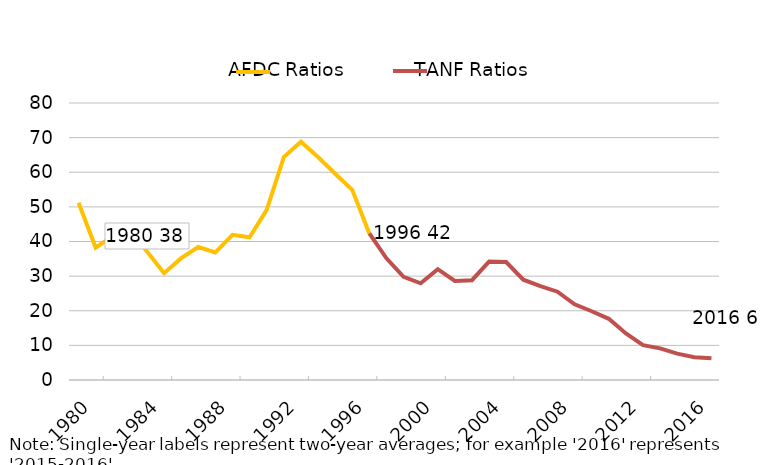
| Category | Arizona |
|---|---|
| nan | 51.211 |
| 1980.0 | 38.248 |
| nan | 41.587 |
| nan | 43.655 |
| nan | 37.099 |
| 1984.0 | 30.856 |
| nan | 35.193 |
| nan | 38.406 |
| nan | 36.843 |
| 1988.0 | 41.949 |
| nan | 41.225 |
| nan | 49.155 |
| nan | 64.39 |
| 1992.0 | 68.822 |
| nan | 64.413 |
| nan | 59.556 |
| nan | 54.929 |
| 1996.0 | 42.314 |
| nan | 35.133 |
| nan | 29.82 |
| nan | 27.926 |
| 2000.0 | 32.013 |
| nan | 28.594 |
| nan | 28.826 |
| nan | 34.208 |
| 2004.0 | 34.061 |
| nan | 28.967 |
| nan | 27.081 |
| nan | 25.496 |
| 2008.0 | 21.865 |
| nan | 19.853 |
| nan | 17.672 |
| nan | 13.434 |
| 2012.0 | 10.077 |
| nan | 9.135 |
| nan | 7.616 |
| nan | 6.586 |
| 2016.0 | 6.248 |